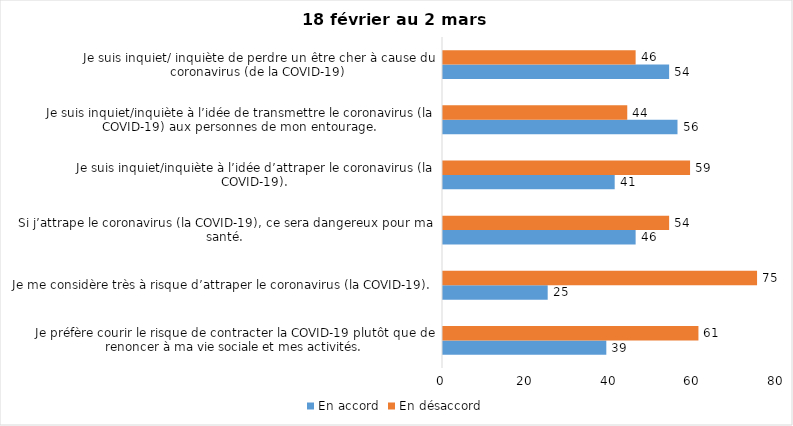
| Category | En accord | En désaccord |
|---|---|---|
| Je préfère courir le risque de contracter la COVID-19 plutôt que de renoncer à ma vie sociale et mes activités. | 39 | 61 |
| Je me considère très à risque d’attraper le coronavirus (la COVID-19). | 25 | 75 |
| Si j’attrape le coronavirus (la COVID-19), ce sera dangereux pour ma santé. | 46 | 54 |
| Je suis inquiet/inquiète à l’idée d’attraper le coronavirus (la COVID-19). | 41 | 59 |
| Je suis inquiet/inquiète à l’idée de transmettre le coronavirus (la COVID-19) aux personnes de mon entourage. | 56 | 44 |
| Je suis inquiet/ inquiète de perdre un être cher à cause du coronavirus (de la COVID-19) | 54 | 46 |